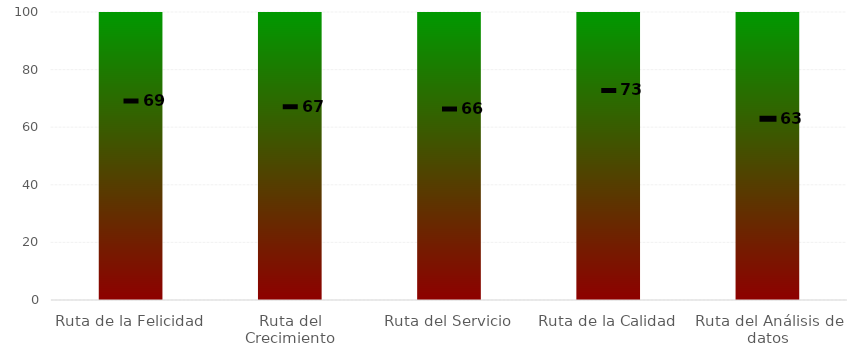
| Category | Niveles |
|---|---|
| Ruta de la Felicidad | 100 |
| Ruta del Crecimiento | 100 |
| Ruta del Servicio | 100 |
| Ruta de la Calidad | 100 |
| Ruta del Análisis de datos | 100 |